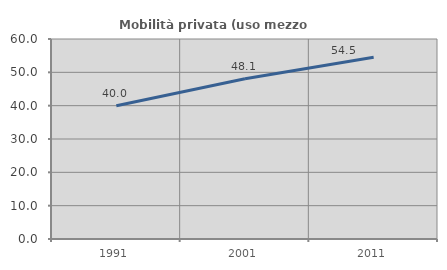
| Category | Mobilità privata (uso mezzo privato) |
|---|---|
| 1991.0 | 40 |
| 2001.0 | 48.077 |
| 2011.0 | 54.545 |